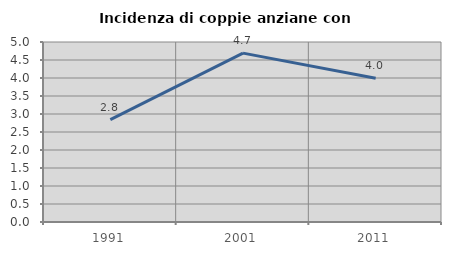
| Category | Incidenza di coppie anziane con figli |
|---|---|
| 1991.0 | 2.845 |
| 2001.0 | 4.691 |
| 2011.0 | 3.993 |